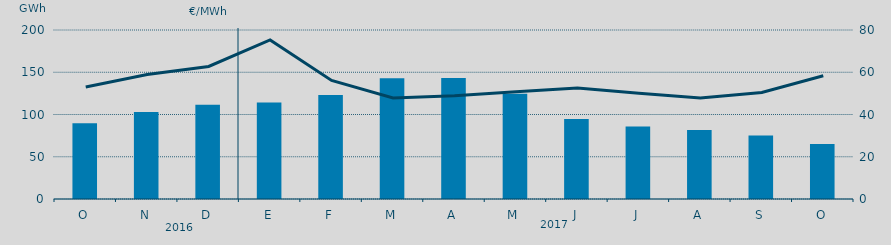
| Category | Energía a subir |
|---|---|
| O | 89660.354 |
| N | 103079.487 |
| D | 111652.906 |
| E | 114098.605 |
| F | 123063.594 |
| M | 142874.975 |
| A | 143332.881 |
| M | 124663.514 |
| J | 94559.541 |
| J | 85673.202 |
| A | 81536.076 |
| S | 75102.289 |
| O | 65089.595 |